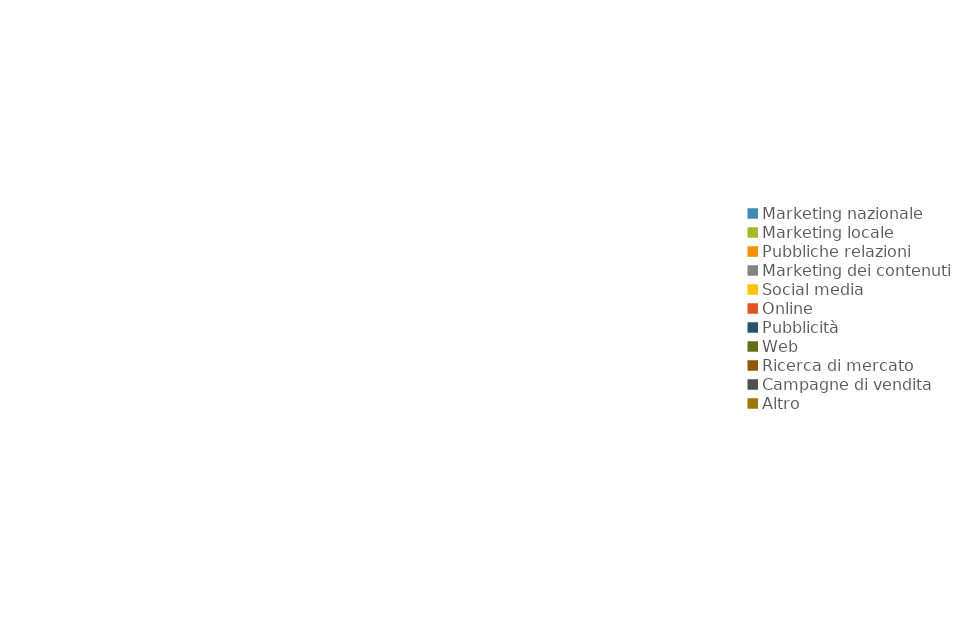
| Category | Series 0 | Series 1 |
|---|---|---|
| Marketing nazionale | 0 | 0 |
| Marketing locale | 0 | 0 |
| Pubbliche relazioni | 0 | 0 |
| Marketing dei contenuti | 0 | 0 |
| Social media | 0 | 0 |
| Online | 0 | 0 |
| Pubblicità | 0 | 0 |
| Web | 0 | 0 |
| Ricerca di mercato | 0 | 0 |
| Campagne di vendita | 0 | 0 |
| Altro | 0 | 0 |